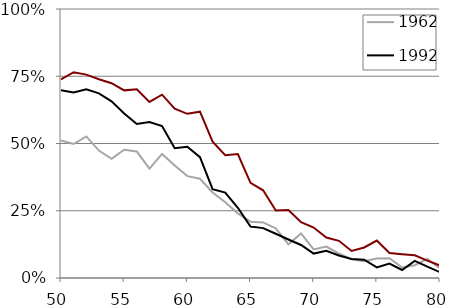
| Category | 1962 | 1992 | 2021 |
|---|---|---|---|
| 50.0 | 0.511 | 0.698 | 0.738 |
| 51.0 | 0.498 | 0.69 | 0.765 |
| 52.0 | 0.526 | 0.702 | 0.756 |
| 53.0 | 0.474 | 0.687 | 0.739 |
| 54.0 | 0.443 | 0.657 | 0.724 |
| 55.0 | 0.477 | 0.612 | 0.698 |
| 56.0 | 0.47 | 0.573 | 0.701 |
| 57.0 | 0.407 | 0.58 | 0.655 |
| 58.0 | 0.461 | 0.565 | 0.681 |
| 59.0 | 0.418 | 0.482 | 0.629 |
| 60.0 | 0.379 | 0.488 | 0.61 |
| 61.0 | 0.369 | 0.449 | 0.618 |
| 62.0 | 0.318 | 0.33 | 0.507 |
| 63.0 | 0.282 | 0.318 | 0.457 |
| 64.0 | 0.24 | 0.261 | 0.461 |
| 65.0 | 0.209 | 0.191 | 0.353 |
| 66.0 | 0.207 | 0.185 | 0.326 |
| 67.0 | 0.185 | 0.164 | 0.251 |
| 68.0 | 0.125 | 0.143 | 0.253 |
| 69.0 | 0.166 | 0.123 | 0.207 |
| 70.0 | 0.106 | 0.091 | 0.187 |
| 71.0 | 0.117 | 0.101 | 0.151 |
| 72.0 | 0.091 | 0.084 | 0.138 |
| 73.0 | 0.069 | 0.071 | 0.101 |
| 74.0 | 0.062 | 0.068 | 0.114 |
| 75.0 | 0.072 | 0.039 | 0.139 |
| 76.0 | 0.074 | 0.054 | 0.093 |
| 77.0 | 0.039 | 0.03 | 0.088 |
| 78.0 | 0.047 | 0.064 | 0.084 |
| 79.0 | 0.071 | 0.042 | 0.065 |
| 80.0 | 0.035 | 0.022 | 0.046 |